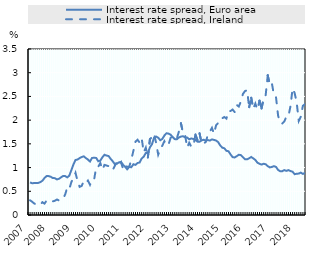
| Category | Interest rate spread, Euro area | Interest rate spread, Ireland |
|---|---|---|
| 2007.0 | 0.687 | 0.31 |
| nan | 0.67 | 0.28 |
| nan | 0.673 | 0.243 |
| nan | 0.673 | 0.223 |
| nan | 0.677 | 0.243 |
| nan | 0.693 | 0.223 |
| nan | 0.723 | 0.27 |
| nan | 0.78 | 0.24 |
| nan | 0.82 | 0.303 |
| nan | 0.82 | 0.28 |
| 2008.0 | 0.807 | 0.287 |
| nan | 0.78 | 0.287 |
| nan | 0.777 | 0.3 |
| nan | 0.75 | 0.327 |
| nan | 0.763 | 0.307 |
| nan | 0.793 | 0.323 |
| nan | 0.823 | 0.347 |
| nan | 0.82 | 0.433 |
| nan | 0.793 | 0.577 |
| nan | 0.83 | 0.547 |
| nan | 0.947 | 0.697 |
| nan | 1.067 | 0.77 |
| 2009.0 | 1.16 | 0.887 |
| nan | 1.17 | 0.717 |
| nan | 1.2 | 0.593 |
| nan | 1.223 | 0.613 |
| nan | 1.237 | 0.717 |
| nan | 1.2 | 0.68 |
| nan | 1.17 | 0.727 |
| nan | 1.127 | 0.637 |
| nan | 1.203 | 0.74 |
| nan | 1.207 | 0.747 |
| nan | 1.203 | 1.007 |
| nan | 1.133 | 1.017 |
| 2010.0 | 1.147 | 1.097 |
| nan | 1.217 | 0.953 |
| nan | 1.27 | 1.057 |
| nan | 1.253 | 1.043 |
| nan | 1.243 | 1.03 |
| nan | 1.183 | 0.96 |
| nan | 1.133 | 0.95 |
| nan | 1.073 | 1.033 |
| nan | 1.08 | 1.12 |
| nan | 1.11 | 1.053 |
| nan | 1.12 | 1.113 |
| nan | 1.06 | 0.97 |
| 2011.0 | 1.017 | 1.047 |
| nan | 0.963 | 1.017 |
| nan | 1.013 | 1.02 |
| nan | 1.007 | 1.167 |
| nan | 1.07 | 1.353 |
| nan | 1.057 | 1.547 |
| nan | 1.097 | 1.587 |
| nan | 1.107 | 1.527 |
| nan | 1.19 | 1.62 |
| nan | 1.23 | 1.323 |
| nan | 1.307 | 1.42 |
| nan | 1.307 | 1.213 |
| 2012.0 | 1.427 | 1.6 |
| nan | 1.493 | 1.64 |
| nan | 1.63 | 1.713 |
| nan | 1.653 | 1.517 |
| nan | 1.63 | 1.273 |
| nan | 1.577 | 1.39 |
| nan | 1.603 | 1.463 |
| nan | 1.677 | 1.557 |
| nan | 1.723 | 1.47 |
| nan | 1.717 | 1.483 |
| nan | 1.693 | 1.627 |
| nan | 1.643 | 1.663 |
| 2013.0 | 1.6 | 1.65 |
| nan | 1.597 | 1.613 |
| nan | 1.633 | 1.757 |
| nan | 1.653 | 1.933 |
| nan | 1.66 | 1.727 |
| nan | 1.637 | 1.69 |
| nan | 1.633 | 1.423 |
| nan | 1.597 | 1.523 |
| nan | 1.613 | 1.44 |
| nan | 1.603 | 1.447 |
| nan | 1.583 | 1.697 |
| nan | 1.547 | 1.577 |
| 2014.0 | 1.543 | 1.723 |
| nan | 1.573 | 1.507 |
| nan | 1.587 | 1.507 |
| nan | 1.57 | 1.54 |
| nan | 1.58 | 1.683 |
| nan | 1.57 | 1.76 |
| nan | 1.593 | 1.837 |
| nan | 1.583 | 1.713 |
| nan | 1.57 | 1.893 |
| nan | 1.537 | 1.94 |
| nan | 1.467 | 2.033 |
| nan | 1.42 | 2.04 |
| 2015.0 | 1.407 | 2.067 |
| nan | 1.353 | 2.033 |
| nan | 1.343 | 2.187 |
| nan | 1.277 | 2.193 |
| nan | 1.22 | 2.223 |
| nan | 1.213 | 2.17 |
| nan | 1.24 | 2.32 |
| nan | 1.27 | 2.287 |
| nan | 1.263 | 2.393 |
| nan | 1.22 | 2.553 |
| nan | 1.177 | 2.613 |
| 2016.0 | 1.173 | 2.63 |
| nan | 1.197 | 2.273 |
| nan | 1.223 | 2.473 |
| nan | 1.193 | 2.24 |
| nan | 1.16 | 2.35 |
| nan | 1.103 | 2.223 |
| nan | 1.08 | 2.41 |
| nan | 1.063 | 2.247 |
| nan | 1.08 | 2.457 |
| nan | 1.07 | 2.53 |
| nan | 1.03 | 2.947 |
| nan | 1.003 | 2.737 |
| 2017.0 | 1.013 | 2.777 |
| nan | 1.03 | 2.53 |
| nan | 1.013 | 2.48 |
| nan | 0.95 | 2.097 |
| nan | 0.923 | 1.947 |
| nan | 0.923 | 1.93 |
| nan | 0.947 | 1.973 |
| nan | 0.93 | 2.07 |
| nan | 0.947 | 2.077 |
| nan | 0.927 | 2.297 |
| nan | 0.913 | 2.667 |
| nan | 0.86 | 2.573 |
| 2018.0 | 0.87 | 2.37 |
| nan | 0.873 | 1.983 |
| nan | 0.893 | 2.073 |
| nan | 0.867 | 2.303 |
| nan | 0.887 | 2.337 |